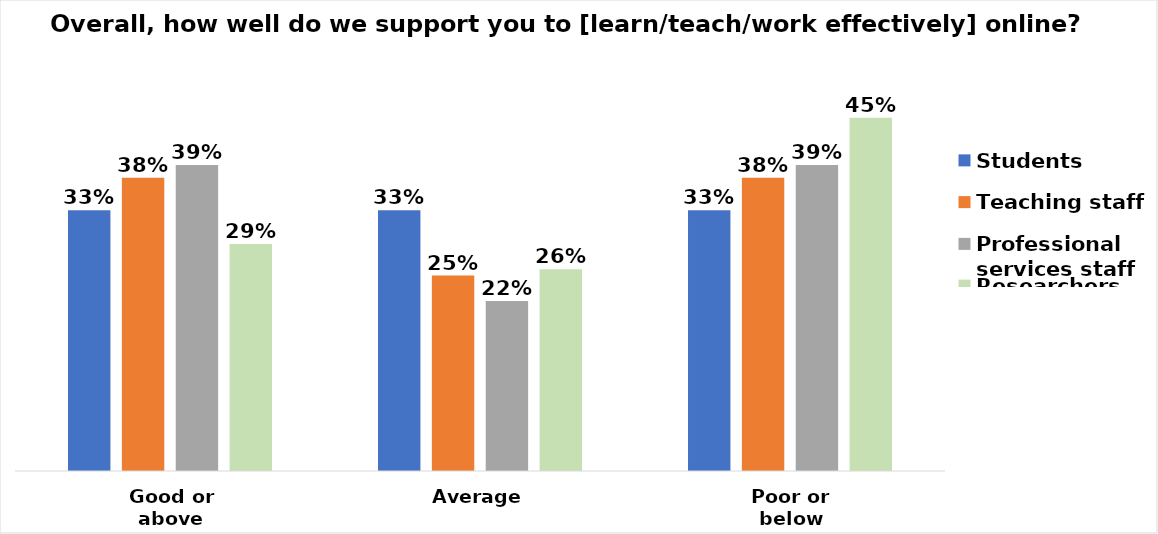
| Category | Students | Teaching staff | Professional services staff | Researchers |
|---|---|---|---|---|
| Good or above | 0.333 | 0.375 | 0.391 | 0.29 |
| Average | 0.333 | 0.25 | 0.217 | 0.258 |
| Poor or below | 0.333 | 0.375 | 0.391 | 0.452 |